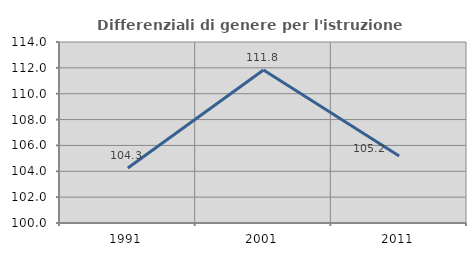
| Category | Differenziali di genere per l'istruzione superiore |
|---|---|
| 1991.0 | 104.255 |
| 2001.0 | 111.839 |
| 2011.0 | 105.182 |